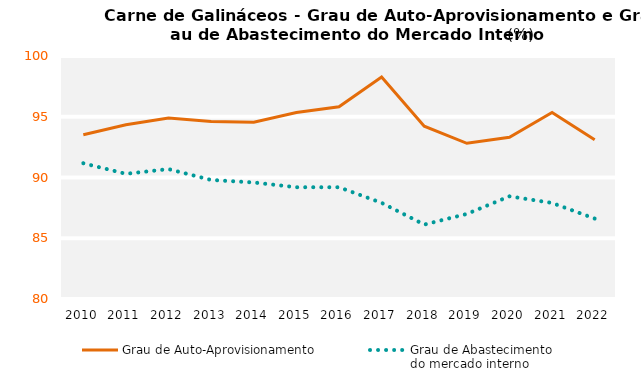
| Category | Grau de Auto-Aprovisionamento | Grau de Abastecimento
do mercado interno |
|---|---|---|
| 2010.0 | 93.522 | 91.171 |
| 2011.0 | 94.343 | 90.303 |
| 2012.0 | 94.898 | 90.692 |
| 2013.0 | 94.618 | 89.798 |
| 2014.0 | 94.542 | 89.59 |
| 2015.0 | 95.344 | 89.199 |
| 2016.0 | 95.824 | 89.198 |
| 2017.0 | 98.276 | 87.913 |
| 2018.0 | 94.22 | 86.124 |
| 2019.0 | 92.817 | 87.001 |
| 2020.0 | 93.305 | 88.451 |
| 2021.0 | 95.35 | 87.906 |
| 2022.0 | 93.115 | 86.62 |